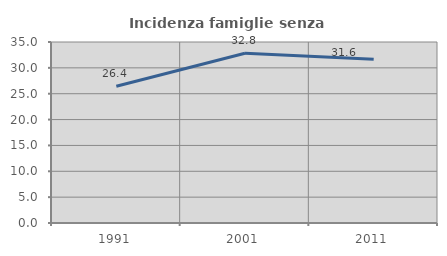
| Category | Incidenza famiglie senza nuclei |
|---|---|
| 1991.0 | 26.449 |
| 2001.0 | 32.817 |
| 2011.0 | 31.642 |